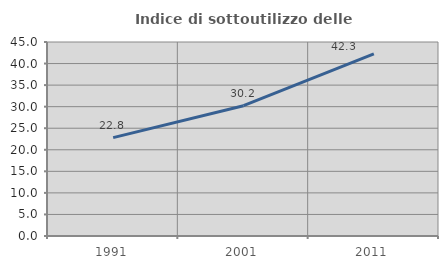
| Category | Indice di sottoutilizzo delle abitazioni  |
|---|---|
| 1991.0 | 22.812 |
| 2001.0 | 30.223 |
| 2011.0 | 42.254 |